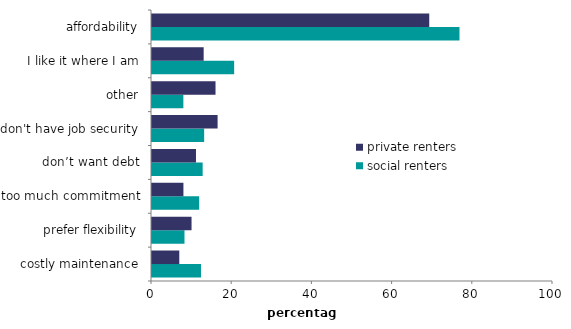
| Category | social renters | private renters |
|---|---|---|
| costly maintenance | 12.217 | 6.806 |
| prefer flexibility | 8.101 | 9.861 |
| too much commitment | 11.759 | 7.837 |
| don’t want debt | 12.636 | 10.97 |
| don't have job security | 13.006 | 16.357 |
| other | 7.821 | 15.839 |
| I like it where I am | 20.487 | 12.884 |
| affordability | 76.681 | 69.138 |